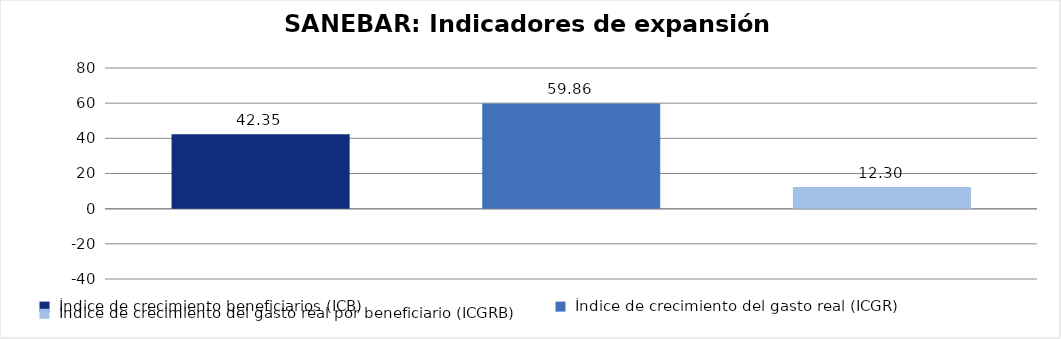
| Category |  Total Programa  |
|---|---|
|  Índice de crecimiento beneficiarios (ICB)   | 42.353 |
|  Índice de crecimiento del gasto real (ICGR)   | 59.864 |
|  Índice de crecimiento del gasto real por beneficiario (ICGRB)   | 12.301 |